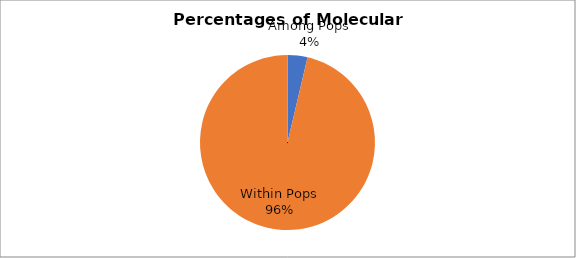
| Category | Est. Var. |
|---|---|
| Among Pops | 0.778 |
| Within Pops | 20.315 |